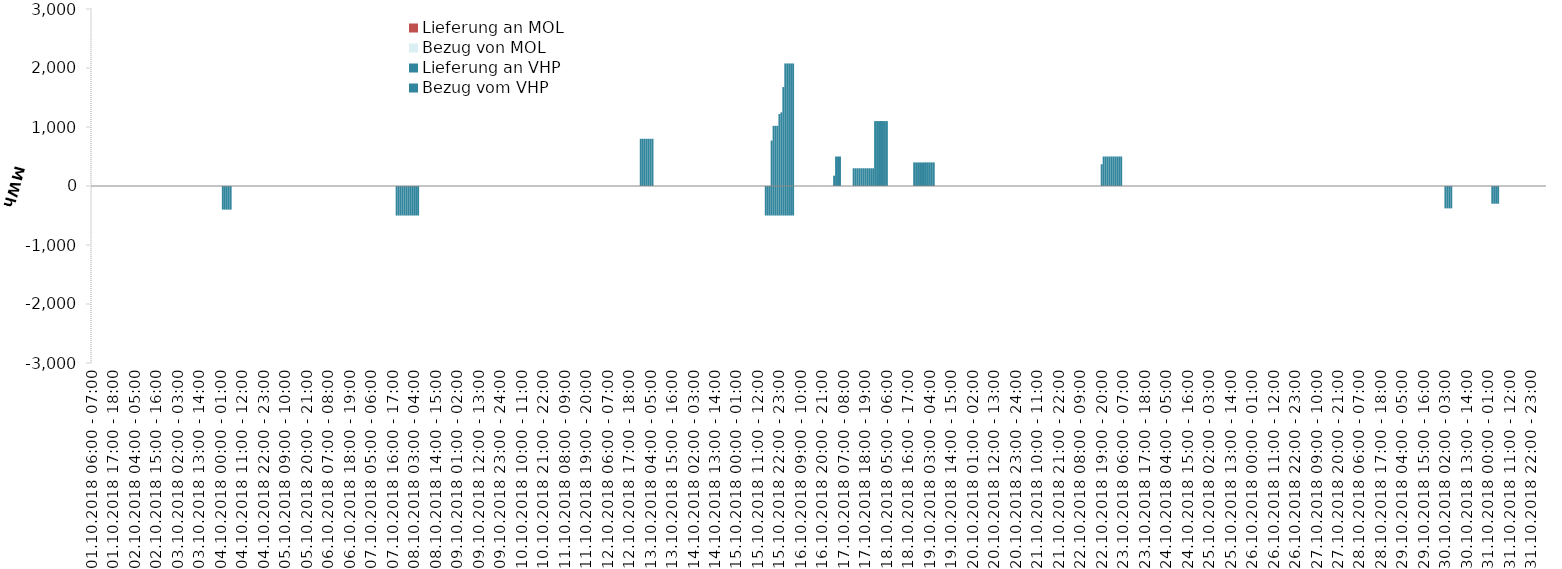
| Category | Bezug vom VHP | Lieferung an VHP | Bezug von MOL | Lieferung an MOL |
|---|---|---|---|---|
| 01.10.2018 06:00 - 07:00 | 0 | 0 | 0 | 0 |
| 01.10.2018 07:00 - 08:00 | 0 | 0 | 0 | 0 |
| 01.10.2018 08:00 - 09:00 | 0 | 0 | 0 | 0 |
| 01.10.2018 09:00 - 10:00 | 0 | 0 | 0 | 0 |
| 01.10.2018 10:00 - 11:00 | 0 | 0 | 0 | 0 |
| 01.10.2018 11:00 - 12:00 | 0 | 0 | 0 | 0 |
| 01.10.2018 12:00 - 13:00 | 0 | 0 | 0 | 0 |
| 01.10.2018 13:00 - 14:00 | 0 | 0 | 0 | 0 |
| 01.10.2018 14:00 - 15:00 | 0 | 0 | 0 | 0 |
| 01.10.2018 15:00 - 16:00 | 0 | 0 | 0 | 0 |
| 01.10.2018 16:00 - 17:00 | 0 | 0 | 0 | 0 |
| 01.10.2018 17:00 - 18:00 | 0 | 0 | 0 | 0 |
| 01.10.2018 18:00 - 19:00 | 0 | 0 | 0 | 0 |
| 01.10.2018 19:00 - 20:00 | 0 | 0 | 0 | 0 |
| 01.10.2018 20:00 - 21:00 | 0 | 0 | 0 | 0 |
| 01.10.2018 21:00 - 22:00 | 0 | 0 | 0 | 0 |
| 01.10.2018 22:00 - 23:00 | 0 | 0 | 0 | 0 |
| 01.10.2018 23:00 - 24:00 | 0 | 0 | 0 | 0 |
| 02.10.2018 00:00 - 01:00 | 0 | 0 | 0 | 0 |
| 02.10.2018 01:00 - 02:00 | 0 | 0 | 0 | 0 |
| 02.10.2018 02:00 - 03:00 | 0 | 0 | 0 | 0 |
| 02.10.2018 03:00 - 04:00 | 0 | 0 | 0 | 0 |
| 02.10.2018 04:00 - 05:00 | 0 | 0 | 0 | 0 |
| 02.10.2018 05:00 - 06:00 | 0 | 0 | 0 | 0 |
| 02.10.2018 06:00 - 07:00 | 0 | 0 | 0 | 0 |
| 02.10.2018 07:00 - 08:00 | 0 | 0 | 0 | 0 |
| 02.10.2018 08:00 - 09:00 | 0 | 0 | 0 | 0 |
| 02.10.2018 09:00 - 10:00 | 0 | 0 | 0 | 0 |
| 02.10.2018 10:00 - 11:00 | 0 | 0 | 0 | 0 |
| 02.10.2018 11:00 - 12:00 | 0 | 0 | 0 | 0 |
| 02.10.2018 12:00 - 13:00 | 0 | 0 | 0 | 0 |
| 02.10.2018 13:00 - 14:00 | 0 | 0 | 0 | 0 |
| 02.10.2018 14:00 - 15:00 | 0 | 0 | 0 | 0 |
| 02.10.2018 15:00 - 16:00 | 0 | 0 | 0 | 0 |
| 02.10.2018 16:00 - 17:00 | 0 | 0 | 0 | 0 |
| 02.10.2018 17:00 - 18:00 | 0 | 0 | 0 | 0 |
| 02.10.2018 18:00 - 19:00 | 0 | 0 | 0 | 0 |
| 02.10.2018 19:00 - 20:00 | 0 | 0 | 0 | 0 |
| 02.10.2018 20:00 - 21:00 | 0 | 0 | 0 | 0 |
| 02.10.2018 21:00 - 22:00 | 0 | 0 | 0 | 0 |
| 02.10.2018 22:00 - 23:00 | 0 | 0 | 0 | 0 |
| 02.10.2018 23:00 - 24:00 | 0 | 0 | 0 | 0 |
| 03.10.2018 00:00 - 01:00 | 0 | 0 | 0 | 0 |
| 03.10.2018 01:00 - 02:00 | 0 | 0 | 0 | 0 |
| 03.10.2018 02:00 - 03:00 | 0 | 0 | 0 | 0 |
| 03.10.2018 03:00 - 04:00 | 0 | 0 | 0 | 0 |
| 03.10.2018 04:00 - 05:00 | 0 | 0 | 0 | 0 |
| 03.10.2018 05:00 - 06:00 | 0 | 0 | 0 | 0 |
| 03.10.2018 06:00 - 07:00 | 0 | 0 | 0 | 0 |
| 03.10.2018 07:00 - 08:00 | 0 | 0 | 0 | 0 |
| 03.10.2018 08:00 - 09:00 | 0 | 0 | 0 | 0 |
| 03.10.2018 09:00 - 10:00 | 0 | 0 | 0 | 0 |
| 03.10.2018 10:00 - 11:00 | 0 | 0 | 0 | 0 |
| 03.10.2018 11:00 - 12:00 | 0 | 0 | 0 | 0 |
| 03.10.2018 12:00 - 13:00 | 0 | 0 | 0 | 0 |
| 03.10.2018 13:00 - 14:00 | 0 | 0 | 0 | 0 |
| 03.10.2018 14:00 - 15:00 | 0 | 0 | 0 | 0 |
| 03.10.2018 15:00 - 16:00 | 0 | 0 | 0 | 0 |
| 03.10.2018 16:00 - 17:00 | 0 | 0 | 0 | 0 |
| 03.10.2018 17:00 - 18:00 | 0 | 0 | 0 | 0 |
| 03.10.2018 18:00 - 19:00 | 0 | 0 | 0 | 0 |
| 03.10.2018 19:00 - 20:00 | 0 | 0 | 0 | 0 |
| 03.10.2018 20:00 - 21:00 | 0 | 0 | 0 | 0 |
| 03.10.2018 21:00 - 22:00 | 0 | 0 | 0 | 0 |
| 03.10.2018 22:00 - 23:00 | 0 | 0 | 0 | 0 |
| 03.10.2018 23:00 - 24:00 | 0 | 0 | 0 | 0 |
| 04.10.2018 00:00 - 01:00 | 0 | 0 | 0 | 0 |
| 04.10.2018 01:00 - 02:00 | 0 | -400 | 0 | 0 |
| 04.10.2018 02:00 - 03:00 | 0 | -400 | 0 | 0 |
| 04.10.2018 03:00 - 04:00 | 0 | -400 | 0 | 0 |
| 04.10.2018 04:00 - 05:00 | 0 | -400 | 0 | 0 |
| 04.10.2018 05:00 - 06:00 | 0 | -400 | 0 | 0 |
| 04.10.2018 06:00 - 07:00 | 0 | 0 | 0 | 0 |
| 04.10.2018 07:00 - 08:00 | 0 | 0 | 0 | 0 |
| 04.10.2018 08:00 - 09:00 | 0 | 0 | 0 | 0 |
| 04.10.2018 09:00 - 10:00 | 0 | 0 | 0 | 0 |
| 04.10.2018 10:00 - 11:00 | 0 | 0 | 0 | 0 |
| 04.10.2018 11:00 - 12:00 | 0 | 0 | 0 | 0 |
| 04.10.2018 12:00 - 13:00 | 0 | 0 | 0 | 0 |
| 04.10.2018 13:00 - 14:00 | 0 | 0 | 0 | 0 |
| 04.10.2018 14:00 - 15:00 | 0 | 0 | 0 | 0 |
| 04.10.2018 15:00 - 16:00 | 0 | 0 | 0 | 0 |
| 04.10.2018 16:00 - 17:00 | 0 | 0 | 0 | 0 |
| 04.10.2018 17:00 - 18:00 | 0 | 0 | 0 | 0 |
| 04.10.2018 18:00 - 19:00 | 0 | 0 | 0 | 0 |
| 04.10.2018 19:00 - 20:00 | 0 | 0 | 0 | 0 |
| 04.10.2018 20:00 - 21:00 | 0 | 0 | 0 | 0 |
| 04.10.2018 21:00 - 22:00 | 0 | 0 | 0 | 0 |
| 04.10.2018 22:00 - 23:00 | 0 | 0 | 0 | 0 |
| 04.10.2018 23:00 - 24:00 | 0 | 0 | 0 | 0 |
| 05.10.2018 00:00 - 01:00 | 0 | 0 | 0 | 0 |
| 05.10.2018 01:00 - 02:00 | 0 | 0 | 0 | 0 |
| 05.10.2018 02:00 - 03:00 | 0 | 0 | 0 | 0 |
| 05.10.2018 03:00 - 04:00 | 0 | 0 | 0 | 0 |
| 05.10.2018 04:00 - 05:00 | 0 | 0 | 0 | 0 |
| 05.10.2018 05:00 - 06:00 | 0 | 0 | 0 | 0 |
| 05.10.2018 06:00 - 07:00 | 0 | 0 | 0 | 0 |
| 05.10.2018 07:00 - 08:00 | 0 | 0 | 0 | 0 |
| 05.10.2018 08:00 - 09:00 | 0 | 0 | 0 | 0 |
| 05.10.2018 09:00 - 10:00 | 0 | 0 | 0 | 0 |
| 05.10.2018 10:00 - 11:00 | 0 | 0 | 0 | 0 |
| 05.10.2018 11:00 - 12:00 | 0 | 0 | 0 | 0 |
| 05.10.2018 12:00 - 13:00 | 0 | 0 | 0 | 0 |
| 05.10.2018 13:00 - 14:00 | 0 | 0 | 0 | 0 |
| 05.10.2018 14:00 - 15:00 | 0 | 0 | 0 | 0 |
| 05.10.2018 15:00 - 16:00 | 0 | 0 | 0 | 0 |
| 05.10.2018 16:00 - 17:00 | 0 | 0 | 0 | 0 |
| 05.10.2018 17:00 - 18:00 | 0 | 0 | 0 | 0 |
| 05.10.2018 18:00 - 19:00 | 0 | 0 | 0 | 0 |
| 05.10.2018 19:00 - 20:00 | 0 | 0 | 0 | 0 |
| 05.10.2018 20:00 - 21:00 | 0 | 0 | 0 | 0 |
| 05.10.2018 21:00 - 22:00 | 0 | 0 | 0 | 0 |
| 05.10.2018 22:00 - 23:00 | 0 | 0 | 0 | 0 |
| 05.10.2018 23:00 - 24:00 | 0 | 0 | 0 | 0 |
| 06.10.2018 00:00 - 01:00 | 0 | 0 | 0 | 0 |
| 06.10.2018 01:00 - 02:00 | 0 | 0 | 0 | 0 |
| 06.10.2018 02:00 - 03:00 | 0 | 0 | 0 | 0 |
| 06.10.2018 03:00 - 04:00 | 0 | 0 | 0 | 0 |
| 06.10.2018 04:00 - 05:00 | 0 | 0 | 0 | 0 |
| 06.10.2018 05:00 - 06:00 | 0 | 0 | 0 | 0 |
| 06.10.2018 06:00 - 07:00 | 0 | 0 | 0 | 0 |
| 06.10.2018 07:00 - 08:00 | 0 | 0 | 0 | 0 |
| 06.10.2018 08:00 - 09:00 | 0 | 0 | 0 | 0 |
| 06.10.2018 09:00 - 10:00 | 0 | 0 | 0 | 0 |
| 06.10.2018 10:00 - 11:00 | 0 | 0 | 0 | 0 |
| 06.10.2018 11:00 - 12:00 | 0 | 0 | 0 | 0 |
| 06.10.2018 12:00 - 13:00 | 0 | 0 | 0 | 0 |
| 06.10.2018 13:00 - 14:00 | 0 | 0 | 0 | 0 |
| 06.10.2018 14:00 - 15:00 | 0 | 0 | 0 | 0 |
| 06.10.2018 15:00 - 16:00 | 0 | 0 | 0 | 0 |
| 06.10.2018 16:00 - 17:00 | 0 | 0 | 0 | 0 |
| 06.10.2018 17:00 - 18:00 | 0 | 0 | 0 | 0 |
| 06.10.2018 18:00 - 19:00 | 0 | 0 | 0 | 0 |
| 06.10.2018 19:00 - 20:00 | 0 | 0 | 0 | 0 |
| 06.10.2018 20:00 - 21:00 | 0 | 0 | 0 | 0 |
| 06.10.2018 21:00 - 22:00 | 0 | 0 | 0 | 0 |
| 06.10.2018 22:00 - 23:00 | 0 | 0 | 0 | 0 |
| 06.10.2018 23:00 - 24:00 | 0 | 0 | 0 | 0 |
| 07.10.2018 00:00 - 01:00 | 0 | 0 | 0 | 0 |
| 07.10.2018 01:00 - 02:00 | 0 | 0 | 0 | 0 |
| 07.10.2018 02:00 - 03:00 | 0 | 0 | 0 | 0 |
| 07.10.2018 03:00 - 04:00 | 0 | 0 | 0 | 0 |
| 07.10.2018 04:00 - 05:00 | 0 | 0 | 0 | 0 |
| 07.10.2018 05:00 - 06:00 | 0 | 0 | 0 | 0 |
| 07.10.2018 06:00 - 07:00 | 0 | 0 | 0 | 0 |
| 07.10.2018 07:00 - 08:00 | 0 | 0 | 0 | 0 |
| 07.10.2018 08:00 - 09:00 | 0 | 0 | 0 | 0 |
| 07.10.2018 09:00 - 10:00 | 0 | 0 | 0 | 0 |
| 07.10.2018 10:00 - 11:00 | 0 | 0 | 0 | 0 |
| 07.10.2018 11:00 - 12:00 | 0 | 0 | 0 | 0 |
| 07.10.2018 12:00 - 13:00 | 0 | 0 | 0 | 0 |
| 07.10.2018 13:00 - 14:00 | 0 | 0 | 0 | 0 |
| 07.10.2018 14:00 - 15:00 | 0 | 0 | 0 | 0 |
| 07.10.2018 15:00 - 16:00 | 0 | 0 | 0 | 0 |
| 07.10.2018 16:00 - 17:00 | 0 | 0 | 0 | 0 |
| 07.10.2018 17:00 - 18:00 | 0 | 0 | 0 | 0 |
| 07.10.2018 18:00 - 19:00 | 0 | -500 | 0 | 0 |
| 07.10.2018 19:00 - 20:00 | 0 | -500 | 0 | 0 |
| 07.10.2018 20:00 - 21:00 | 0 | -500 | 0 | 0 |
| 07.10.2018 21:00 - 22:00 | 0 | -500 | 0 | 0 |
| 07.10.2018 22:00 - 23:00 | 0 | -500 | 0 | 0 |
| 07.10.2018 23:00 - 24:00 | 0 | -500 | 0 | 0 |
| 08.10.2018 00:00 - 01:00 | 0 | -500 | 0 | 0 |
| 08.10.2018 01:00 - 02:00 | 0 | -500 | 0 | 0 |
| 08.10.2018 02:00 - 03:00 | 0 | -500 | 0 | 0 |
| 08.10.2018 03:00 - 04:00 | 0 | -500 | 0 | 0 |
| 08.10.2018 04:00 - 05:00 | 0 | -500 | 0 | 0 |
| 08.10.2018 05:00 - 06:00 | 0 | -500 | 0 | 0 |
| 08.10.2018 06:00 - 07:00 | 0 | 0 | 0 | 0 |
| 08.10.2018 07:00 - 08:00 | 0 | 0 | 0 | 0 |
| 08.10.2018 08:00 - 09:00 | 0 | 0 | 0 | 0 |
| 08.10.2018 09:00 - 10:00 | 0 | 0 | 0 | 0 |
| 08.10.2018 10:00 - 11:00 | 0 | 0 | 0 | 0 |
| 08.10.2018 11:00 - 12:00 | 0 | 0 | 0 | 0 |
| 08.10.2018 12:00 - 13:00 | 0 | 0 | 0 | 0 |
| 08.10.2018 13:00 - 14:00 | 0 | 0 | 0 | 0 |
| 08.10.2018 14:00 - 15:00 | 0 | 0 | 0 | 0 |
| 08.10.2018 15:00 - 16:00 | 0 | 0 | 0 | 0 |
| 08.10.2018 16:00 - 17:00 | 0 | 0 | 0 | 0 |
| 08.10.2018 17:00 - 18:00 | 0 | 0 | 0 | 0 |
| 08.10.2018 18:00 - 19:00 | 0 | 0 | 0 | 0 |
| 08.10.2018 19:00 - 20:00 | 0 | 0 | 0 | 0 |
| 08.10.2018 20:00 - 21:00 | 0 | 0 | 0 | 0 |
| 08.10.2018 21:00 - 22:00 | 0 | 0 | 0 | 0 |
| 08.10.2018 22:00 - 23:00 | 0 | 0 | 0 | 0 |
| 08.10.2018 23:00 - 24:00 | 0 | 0 | 0 | 0 |
| 09.10.2018 00:00 - 01:00 | 0 | 0 | 0 | 0 |
| 09.10.2018 01:00 - 02:00 | 0 | 0 | 0 | 0 |
| 09.10.2018 02:00 - 03:00 | 0 | 0 | 0 | 0 |
| 09.10.2018 03:00 - 04:00 | 0 | 0 | 0 | 0 |
| 09.10.2018 04:00 - 05:00 | 0 | 0 | 0 | 0 |
| 09.10.2018 05:00 - 06:00 | 0 | 0 | 0 | 0 |
| 09.10.2018 06:00 - 07:00 | 0 | 0 | 0 | 0 |
| 09.10.2018 07:00 - 08:00 | 0 | 0 | 0 | 0 |
| 09.10.2018 08:00 - 09:00 | 0 | 0 | 0 | 0 |
| 09.10.2018 09:00 - 10:00 | 0 | 0 | 0 | 0 |
| 09.10.2018 10:00 - 11:00 | 0 | 0 | 0 | 0 |
| 09.10.2018 11:00 - 12:00 | 0 | 0 | 0 | 0 |
| 09.10.2018 12:00 - 13:00 | 0 | 0 | 0 | 0 |
| 09.10.2018 13:00 - 14:00 | 0 | 0 | 0 | 0 |
| 09.10.2018 14:00 - 15:00 | 0 | 0 | 0 | 0 |
| 09.10.2018 15:00 - 16:00 | 0 | 0 | 0 | 0 |
| 09.10.2018 16:00 - 17:00 | 0 | 0 | 0 | 0 |
| 09.10.2018 17:00 - 18:00 | 0 | 0 | 0 | 0 |
| 09.10.2018 18:00 - 19:00 | 0 | 0 | 0 | 0 |
| 09.10.2018 19:00 - 20:00 | 0 | 0 | 0 | 0 |
| 09.10.2018 20:00 - 21:00 | 0 | 0 | 0 | 0 |
| 09.10.2018 21:00 - 22:00 | 0 | 0 | 0 | 0 |
| 09.10.2018 22:00 - 23:00 | 0 | 0 | 0 | 0 |
| 09.10.2018 23:00 - 24:00 | 0 | 0 | 0 | 0 |
| 10.10.2018 00:00 - 01:00 | 0 | 0 | 0 | 0 |
| 10.10.2018 01:00 - 02:00 | 0 | 0 | 0 | 0 |
| 10.10.2018 02:00 - 03:00 | 0 | 0 | 0 | 0 |
| 10.10.2018 03:00 - 04:00 | 0 | 0 | 0 | 0 |
| 10.10.2018 04:00 - 05:00 | 0 | 0 | 0 | 0 |
| 10.10.2018 05:00 - 06:00 | 0 | 0 | 0 | 0 |
| 10.10.2018 06:00 - 07:00 | 0 | 0 | 0 | 0 |
| 10.10.2018 07:00 - 08:00 | 0 | 0 | 0 | 0 |
| 10.10.2018 08:00 - 09:00 | 0 | 0 | 0 | 0 |
| 10.10.2018 09:00 - 10:00 | 0 | 0 | 0 | 0 |
| 10.10.2018 10:00 - 11:00 | 0 | 0 | 0 | 0 |
| 10.10.2018 11:00 - 12:00 | 0 | 0 | 0 | 0 |
| 10.10.2018 12:00 - 13:00 | 0 | 0 | 0 | 0 |
| 10.10.2018 13:00 - 14:00 | 0 | 0 | 0 | 0 |
| 10.10.2018 14:00 - 15:00 | 0 | 0 | 0 | 0 |
| 10.10.2018 15:00 - 16:00 | 0 | 0 | 0 | 0 |
| 10.10.2018 16:00 - 17:00 | 0 | 0 | 0 | 0 |
| 10.10.2018 17:00 - 18:00 | 0 | 0 | 0 | 0 |
| 10.10.2018 18:00 - 19:00 | 0 | 0 | 0 | 0 |
| 10.10.2018 19:00 - 20:00 | 0 | 0 | 0 | 0 |
| 10.10.2018 20:00 - 21:00 | 0 | 0 | 0 | 0 |
| 10.10.2018 21:00 - 22:00 | 0 | 0 | 0 | 0 |
| 10.10.2018 22:00 - 23:00 | 0 | 0 | 0 | 0 |
| 10.10.2018 23:00 - 24:00 | 0 | 0 | 0 | 0 |
| 11.10.2018 00:00 - 01:00 | 0 | 0 | 0 | 0 |
| 11.10.2018 01:00 - 02:00 | 0 | 0 | 0 | 0 |
| 11.10.2018 02:00 - 03:00 | 0 | 0 | 0 | 0 |
| 11.10.2018 03:00 - 04:00 | 0 | 0 | 0 | 0 |
| 11.10.2018 04:00 - 05:00 | 0 | 0 | 0 | 0 |
| 11.10.2018 05:00 - 06:00 | 0 | 0 | 0 | 0 |
| 11.10.2018 06:00 - 07:00 | 0 | 0 | 0 | 0 |
| 11.10.2018 07:00 - 08:00 | 0 | 0 | 0 | 0 |
| 11.10.2018 08:00 - 09:00 | 0 | 0 | 0 | 0 |
| 11.10.2018 09:00 - 10:00 | 0 | 0 | 0 | 0 |
| 11.10.2018 10:00 - 11:00 | 0 | 0 | 0 | 0 |
| 11.10.2018 11:00 - 12:00 | 0 | 0 | 0 | 0 |
| 11.10.2018 12:00 - 13:00 | 0 | 0 | 0 | 0 |
| 11.10.2018 13:00 - 14:00 | 0 | 0 | 0 | 0 |
| 11.10.2018 14:00 - 15:00 | 0 | 0 | 0 | 0 |
| 11.10.2018 15:00 - 16:00 | 0 | 0 | 0 | 0 |
| 11.10.2018 16:00 - 17:00 | 0 | 0 | 0 | 0 |
| 11.10.2018 17:00 - 18:00 | 0 | 0 | 0 | 0 |
| 11.10.2018 18:00 - 19:00 | 0 | 0 | 0 | 0 |
| 11.10.2018 19:00 - 20:00 | 0 | 0 | 0 | 0 |
| 11.10.2018 20:00 - 21:00 | 0 | 0 | 0 | 0 |
| 11.10.2018 21:00 - 22:00 | 0 | 0 | 0 | 0 |
| 11.10.2018 22:00 - 23:00 | 0 | 0 | 0 | 0 |
| 11.10.2018 23:00 - 24:00 | 0 | 0 | 0 | 0 |
| 12.10.2018 00:00 - 01:00 | 0 | 0 | 0 | 0 |
| 12.10.2018 01:00 - 02:00 | 0 | 0 | 0 | 0 |
| 12.10.2018 02:00 - 03:00 | 0 | 0 | 0 | 0 |
| 12.10.2018 03:00 - 04:00 | 0 | 0 | 0 | 0 |
| 12.10.2018 04:00 - 05:00 | 0 | 0 | 0 | 0 |
| 12.10.2018 05:00 - 06:00 | 0 | 0 | 0 | 0 |
| 12.10.2018 06:00 - 07:00 | 0 | 0 | 0 | 0 |
| 12.10.2018 07:00 - 08:00 | 0 | 0 | 0 | 0 |
| 12.10.2018 08:00 - 09:00 | 0 | 0 | 0 | 0 |
| 12.10.2018 09:00 - 10:00 | 0 | 0 | 0 | 0 |
| 12.10.2018 10:00 - 11:00 | 0 | 0 | 0 | 0 |
| 12.10.2018 11:00 - 12:00 | 0 | 0 | 0 | 0 |
| 12.10.2018 12:00 - 13:00 | 0 | 0 | 0 | 0 |
| 12.10.2018 13:00 - 14:00 | 0 | 0 | 0 | 0 |
| 12.10.2018 14:00 - 15:00 | 0 | 0 | 0 | 0 |
| 12.10.2018 15:00 - 16:00 | 0 | 0 | 0 | 0 |
| 12.10.2018 16:00 - 17:00 | 0 | 0 | 0 | 0 |
| 12.10.2018 17:00 - 18:00 | 0 | 0 | 0 | 0 |
| 12.10.2018 18:00 - 19:00 | 0 | 0 | 0 | 0 |
| 12.10.2018 19:00 - 20:00 | 0 | 0 | 0 | 0 |
| 12.10.2018 20:00 - 21:00 | 0 | 0 | 0 | 0 |
| 12.10.2018 21:00 - 22:00 | 0 | 0 | 0 | 0 |
| 12.10.2018 22:00 - 23:00 | 0 | 0 | 0 | 0 |
| 12.10.2018 23:00 - 24:00 | 800 | 0 | 0 | 0 |
| 13.10.2018 00:00 - 01:00 | 800 | 0 | 0 | 0 |
| 13.10.2018 01:00 - 02:00 | 800 | 0 | 0 | 0 |
| 13.10.2018 02:00 - 03:00 | 800 | 0 | 0 | 0 |
| 13.10.2018 03:00 - 04:00 | 800 | 0 | 0 | 0 |
| 13.10.2018 04:00 - 05:00 | 800 | 0 | 0 | 0 |
| 13.10.2018 05:00 - 06:00 | 800 | 0 | 0 | 0 |
| 13.10.2018 06:00 - 07:00 | 0 | 0 | 0 | 0 |
| 13.10.2018 07:00 - 08:00 | 0 | 0 | 0 | 0 |
| 13.10.2018 08:00 - 09:00 | 0 | 0 | 0 | 0 |
| 13.10.2018 09:00 - 10:00 | 0 | 0 | 0 | 0 |
| 13.10.2018 10:00 - 11:00 | 0 | 0 | 0 | 0 |
| 13.10.2018 11:00 - 12:00 | 0 | 0 | 0 | 0 |
| 13.10.2018 12:00 - 13:00 | 0 | 0 | 0 | 0 |
| 13.10.2018 13:00 - 14:00 | 0 | 0 | 0 | 0 |
| 13.10.2018 14:00 - 15:00 | 0 | 0 | 0 | 0 |
| 13.10.2018 15:00 - 16:00 | 0 | 0 | 0 | 0 |
| 13.10.2018 16:00 - 17:00 | 0 | 0 | 0 | 0 |
| 13.10.2018 17:00 - 18:00 | 0 | 0 | 0 | 0 |
| 13.10.2018 18:00 - 19:00 | 0 | 0 | 0 | 0 |
| 13.10.2018 19:00 - 20:00 | 0 | 0 | 0 | 0 |
| 13.10.2018 20:00 - 21:00 | 0 | 0 | 0 | 0 |
| 13.10.2018 21:00 - 22:00 | 0 | 0 | 0 | 0 |
| 13.10.2018 22:00 - 23:00 | 0 | 0 | 0 | 0 |
| 13.10.2018 23:00 - 24:00 | 0 | 0 | 0 | 0 |
| 14.10.2018 00:00 - 01:00 | 0 | 0 | 0 | 0 |
| 14.10.2018 01:00 - 02:00 | 0 | 0 | 0 | 0 |
| 14.10.2018 02:00 - 03:00 | 0 | 0 | 0 | 0 |
| 14.10.2018 03:00 - 04:00 | 0 | 0 | 0 | 0 |
| 14.10.2018 04:00 - 05:00 | 0 | 0 | 0 | 0 |
| 14.10.2018 05:00 - 06:00 | 0 | 0 | 0 | 0 |
| 14.10.2018 06:00 - 07:00 | 0 | 0 | 0 | 0 |
| 14.10.2018 07:00 - 08:00 | 0 | 0 | 0 | 0 |
| 14.10.2018 08:00 - 09:00 | 0 | 0 | 0 | 0 |
| 14.10.2018 09:00 - 10:00 | 0 | 0 | 0 | 0 |
| 14.10.2018 10:00 - 11:00 | 0 | 0 | 0 | 0 |
| 14.10.2018 11:00 - 12:00 | 0 | 0 | 0 | 0 |
| 14.10.2018 12:00 - 13:00 | 0 | 0 | 0 | 0 |
| 14.10.2018 13:00 - 14:00 | 0 | 0 | 0 | 0 |
| 14.10.2018 14:00 - 15:00 | 0 | 0 | 0 | 0 |
| 14.10.2018 15:00 - 16:00 | 0 | 0 | 0 | 0 |
| 14.10.2018 16:00 - 17:00 | 0 | 0 | 0 | 0 |
| 14.10.2018 17:00 - 18:00 | 0 | 0 | 0 | 0 |
| 14.10.2018 18:00 - 19:00 | 0 | 0 | 0 | 0 |
| 14.10.2018 19:00 - 20:00 | 0 | 0 | 0 | 0 |
| 14.10.2018 20:00 - 21:00 | 0 | 0 | 0 | 0 |
| 14.10.2018 21:00 - 22:00 | 0 | 0 | 0 | 0 |
| 14.10.2018 22:00 - 23:00 | 0 | 0 | 0 | 0 |
| 14.10.2018 23:00 - 24:00 | 0 | 0 | 0 | 0 |
| 15.10.2018 00:00 - 01:00 | 0 | 0 | 0 | 0 |
| 15.10.2018 01:00 - 02:00 | 0 | 0 | 0 | 0 |
| 15.10.2018 02:00 - 03:00 | 0 | 0 | 0 | 0 |
| 15.10.2018 03:00 - 04:00 | 0 | 0 | 0 | 0 |
| 15.10.2018 04:00 - 05:00 | 0 | 0 | 0 | 0 |
| 15.10.2018 05:00 - 06:00 | 0 | 0 | 0 | 0 |
| 15.10.2018 06:00 - 07:00 | 0 | 0 | 0 | 0 |
| 15.10.2018 07:00 - 08:00 | 0 | 0 | 0 | 0 |
| 15.10.2018 08:00 - 09:00 | 0 | 0 | 0 | 0 |
| 15.10.2018 09:00 - 10:00 | 0 | 0 | 0 | 0 |
| 15.10.2018 10:00 - 11:00 | 0 | 0 | 0 | 0 |
| 15.10.2018 11:00 - 12:00 | 0 | 0 | 0 | 0 |
| 15.10.2018 12:00 - 13:00 | 0 | 0 | 0 | 0 |
| 15.10.2018 13:00 - 14:00 | 0 | 0 | 0 | 0 |
| 15.10.2018 14:00 - 15:00 | 0 | 0 | 0 | 0 |
| 15.10.2018 15:00 - 16:00 | 0 | -500 | 0 | 0 |
| 15.10.2018 16:00 - 17:00 | 0 | -500 | 0 | 0 |
| 15.10.2018 17:00 - 18:00 | 0 | -500 | 0 | 0 |
| 15.10.2018 18:00 - 19:00 | 770 | -500 | 0 | 0 |
| 15.10.2018 19:00 - 20:00 | 1020 | -500 | 0 | 0 |
| 15.10.2018 20:00 - 21:00 | 1020 | -500 | 0 | 0 |
| 15.10.2018 21:00 - 22:00 | 1020 | -500 | 0 | 0 |
| 15.10.2018 22:00 - 23:00 | 1220 | -500 | 0 | 0 |
| 15.10.2018 23:00 - 24:00 | 1248 | -500 | 0 | 0 |
| 16.10.2018 00:00 - 01:00 | 1677 | -500 | 0 | 0 |
| 16.10.2018 01:00 - 02:00 | 2077 | -500 | 0 | 0 |
| 16.10.2018 02:00 - 03:00 | 2077 | -500 | 0 | 0 |
| 16.10.2018 03:00 - 04:00 | 2077 | -500 | 0 | 0 |
| 16.10.2018 04:00 - 05:00 | 2077 | -500 | 0 | 0 |
| 16.10.2018 05:00 - 06:00 | 2077 | -500 | 0 | 0 |
| 16.10.2018 06:00 - 07:00 | 0 | 0 | 0 | 0 |
| 16.10.2018 07:00 - 08:00 | 0 | 0 | 0 | 0 |
| 16.10.2018 08:00 - 09:00 | 0 | 0 | 0 | 0 |
| 16.10.2018 09:00 - 10:00 | 0 | 0 | 0 | 0 |
| 16.10.2018 10:00 - 11:00 | 0 | 0 | 0 | 0 |
| 16.10.2018 11:00 - 12:00 | 0 | 0 | 0 | 0 |
| 16.10.2018 12:00 - 13:00 | 0 | 0 | 0 | 0 |
| 16.10.2018 13:00 - 14:00 | 0 | 0 | 0 | 0 |
| 16.10.2018 14:00 - 15:00 | 0 | 0 | 0 | 0 |
| 16.10.2018 15:00 - 16:00 | 0 | 0 | 0 | 0 |
| 16.10.2018 16:00 - 17:00 | 0 | 0 | 0 | 0 |
| 16.10.2018 17:00 - 18:00 | 0 | 0 | 0 | 0 |
| 16.10.2018 18:00 - 19:00 | 0 | 0 | 0 | 0 |
| 16.10.2018 19:00 - 20:00 | 0 | 0 | 0 | 0 |
| 16.10.2018 20:00 - 21:00 | 0 | 0 | 0 | 0 |
| 16.10.2018 21:00 - 22:00 | 0 | 0 | 0 | 0 |
| 16.10.2018 22:00 - 23:00 | 0 | 0 | 0 | 0 |
| 16.10.2018 23:00 - 24:00 | 0 | 0 | 0 | 0 |
| 17.10.2018 00:00 - 01:00 | 0 | 0 | 0 | 0 |
| 17.10.2018 01:00 - 02:00 | 0 | 0 | 0 | 0 |
| 17.10.2018 02:00 - 03:00 | 175 | 0 | 0 | 0 |
| 17.10.2018 03:00 - 04:00 | 500 | 0 | 0 | 0 |
| 17.10.2018 04:00 - 05:00 | 500 | 0 | 0 | 0 |
| 17.10.2018 05:00 - 06:00 | 500 | 0 | 0 | 0 |
| 17.10.2018 06:00 - 07:00 | 0 | 0 | 0 | 0 |
| 17.10.2018 07:00 - 08:00 | 0 | 0 | 0 | 0 |
| 17.10.2018 08:00 - 09:00 | 0 | 0 | 0 | 0 |
| 17.10.2018 09:00 - 10:00 | 0 | 0 | 0 | 0 |
| 17.10.2018 10:00 - 11:00 | 0 | 0 | 0 | 0 |
| 17.10.2018 11:00 - 12:00 | 0 | 0 | 0 | 0 |
| 17.10.2018 12:00 - 13:00 | 300 | 0 | 0 | 0 |
| 17.10.2018 13:00 - 14:00 | 300 | 0 | 0 | 0 |
| 17.10.2018 14:00 - 15:00 | 300 | 0 | 0 | 0 |
| 17.10.2018 15:00 - 16:00 | 300 | 0 | 0 | 0 |
| 17.10.2018 16:00 - 17:00 | 300 | 0 | 0 | 0 |
| 17.10.2018 17:00 - 18:00 | 300 | 0 | 0 | 0 |
| 17.10.2018 18:00 - 19:00 | 300 | 0 | 0 | 0 |
| 17.10.2018 19:00 - 20:00 | 300 | 0 | 0 | 0 |
| 17.10.2018 20:00 - 21:00 | 300 | 0 | 0 | 0 |
| 17.10.2018 21:00 - 22:00 | 300 | 0 | 0 | 0 |
| 17.10.2018 22:00 - 23:00 | 300 | 0 | 0 | 0 |
| 17.10.2018 23:00 - 24:00 | 1100 | 0 | 0 | 0 |
| 18.10.2018 00:00 - 01:00 | 1100 | 0 | 0 | 0 |
| 18.10.2018 01:00 - 02:00 | 1100 | 0 | 0 | 0 |
| 18.10.2018 02:00 - 03:00 | 1100 | 0 | 0 | 0 |
| 18.10.2018 03:00 - 04:00 | 1100 | 0 | 0 | 0 |
| 18.10.2018 04:00 - 05:00 | 1100 | 0 | 0 | 0 |
| 18.10.2018 05:00 - 06:00 | 1100 | 0 | 0 | 0 |
| 18.10.2018 06:00 - 07:00 | 0 | 0 | 0 | 0 |
| 18.10.2018 07:00 - 08:00 | 0 | 0 | 0 | 0 |
| 18.10.2018 08:00 - 09:00 | 0 | 0 | 0 | 0 |
| 18.10.2018 09:00 - 10:00 | 0 | 0 | 0 | 0 |
| 18.10.2018 10:00 - 11:00 | 0 | 0 | 0 | 0 |
| 18.10.2018 11:00 - 12:00 | 0 | 0 | 0 | 0 |
| 18.10.2018 12:00 - 13:00 | 0 | 0 | 0 | 0 |
| 18.10.2018 13:00 - 14:00 | 0 | 0 | 0 | 0 |
| 18.10.2018 14:00 - 15:00 | 0 | 0 | 0 | 0 |
| 18.10.2018 15:00 - 16:00 | 0 | 0 | 0 | 0 |
| 18.10.2018 16:00 - 17:00 | 0 | 0 | 0 | 0 |
| 18.10.2018 17:00 - 18:00 | 0 | 0 | 0 | 0 |
| 18.10.2018 18:00 - 19:00 | 0 | 0 | 0 | 0 |
| 18.10.2018 19:00 - 20:00 | 400 | 0 | 0 | 0 |
| 18.10.2018 20:00 - 21:00 | 400 | 0 | 0 | 0 |
| 18.10.2018 21:00 - 22:00 | 400 | 0 | 0 | 0 |
| 18.10.2018 22:00 - 23:00 | 400 | 0 | 0 | 0 |
| 18.10.2018 23:00 - 24:00 | 400 | 0 | 0 | 0 |
| 19.10.2018 00:00 - 01:00 | 400 | 0 | 0 | 0 |
| 19.10.2018 01:00 - 02:00 | 400 | 0 | 0 | 0 |
| 19.10.2018 02:00 - 03:00 | 400 | 0 | 0 | 0 |
| 19.10.2018 03:00 - 04:00 | 400 | 0 | 0 | 0 |
| 19.10.2018 04:00 - 05:00 | 400 | 0 | 0 | 0 |
| 19.10.2018 05:00 - 06:00 | 400 | 0 | 0 | 0 |
| 19.10.2018 06:00 - 07:00 | 0 | 0 | 0 | 0 |
| 19.10.2018 07:00 - 08:00 | 0 | 0 | 0 | 0 |
| 19.10.2018 08:00 - 09:00 | 0 | 0 | 0 | 0 |
| 19.10.2018 09:00 - 10:00 | 0 | 0 | 0 | 0 |
| 19.10.2018 10:00 - 11:00 | 0 | 0 | 0 | 0 |
| 19.10.2018 11:00 - 12:00 | 0 | 0 | 0 | 0 |
| 19.10.2018 12:00 - 13:00 | 0 | 0 | 0 | 0 |
| 19.10.2018 13:00 - 14:00 | 0 | 0 | 0 | 0 |
| 19.10.2018 14:00 - 15:00 | 0 | 0 | 0 | 0 |
| 19.10.2018 15:00 - 16:00 | 0 | 0 | 0 | 0 |
| 19.10.2018 16:00 - 17:00 | 0 | 0 | 0 | 0 |
| 19.10.2018 17:00 - 18:00 | 0 | 0 | 0 | 0 |
| 19.10.2018 18:00 - 19:00 | 0 | 0 | 0 | 0 |
| 19.10.2018 19:00 - 20:00 | 0 | 0 | 0 | 0 |
| 19.10.2018 20:00 - 21:00 | 0 | 0 | 0 | 0 |
| 19.10.2018 21:00 - 22:00 | 0 | 0 | 0 | 0 |
| 19.10.2018 22:00 - 23:00 | 0 | 0 | 0 | 0 |
| 19.10.2018 23:00 - 24:00 | 0 | 0 | 0 | 0 |
| 20.10.2018 00:00 - 01:00 | 0 | 0 | 0 | 0 |
| 20.10.2018 01:00 - 02:00 | 0 | 0 | 0 | 0 |
| 20.10.2018 02:00 - 03:00 | 0 | 0 | 0 | 0 |
| 20.10.2018 03:00 - 04:00 | 0 | 0 | 0 | 0 |
| 20.10.2018 04:00 - 05:00 | 0 | 0 | 0 | 0 |
| 20.10.2018 05:00 - 06:00 | 0 | 0 | 0 | 0 |
| 20.10.2018 06:00 - 07:00 | 0 | 0 | 0 | 0 |
| 20.10.2018 07:00 - 08:00 | 0 | 0 | 0 | 0 |
| 20.10.2018 08:00 - 09:00 | 0 | 0 | 0 | 0 |
| 20.10.2018 09:00 - 10:00 | 0 | 0 | 0 | 0 |
| 20.10.2018 10:00 - 11:00 | 0 | 0 | 0 | 0 |
| 20.10.2018 11:00 - 12:00 | 0 | 0 | 0 | 0 |
| 20.10.2018 12:00 - 13:00 | 0 | 0 | 0 | 0 |
| 20.10.2018 13:00 - 14:00 | 0 | 0 | 0 | 0 |
| 20.10.2018 14:00 - 15:00 | 0 | 0 | 0 | 0 |
| 20.10.2018 15:00 - 16:00 | 0 | 0 | 0 | 0 |
| 20.10.2018 16:00 - 17:00 | 0 | 0 | 0 | 0 |
| 20.10.2018 17:00 - 18:00 | 0 | 0 | 0 | 0 |
| 20.10.2018 18:00 - 19:00 | 0 | 0 | 0 | 0 |
| 20.10.2018 19:00 - 20:00 | 0 | 0 | 0 | 0 |
| 20.10.2018 20:00 - 21:00 | 0 | 0 | 0 | 0 |
| 20.10.2018 21:00 - 22:00 | 0 | 0 | 0 | 0 |
| 20.10.2018 22:00 - 23:00 | 0 | 0 | 0 | 0 |
| 20.10.2018 23:00 - 24:00 | 0 | 0 | 0 | 0 |
| 21.10.2018 00:00 - 01:00 | 0 | 0 | 0 | 0 |
| 21.10.2018 01:00 - 02:00 | 0 | 0 | 0 | 0 |
| 21.10.2018 02:00 - 03:00 | 0 | 0 | 0 | 0 |
| 21.10.2018 03:00 - 04:00 | 0 | 0 | 0 | 0 |
| 21.10.2018 04:00 - 05:00 | 0 | 0 | 0 | 0 |
| 21.10.2018 05:00 - 06:00 | 0 | 0 | 0 | 0 |
| 21.10.2018 06:00 - 07:00 | 0 | 0 | 0 | 0 |
| 21.10.2018 07:00 - 08:00 | 0 | 0 | 0 | 0 |
| 21.10.2018 08:00 - 09:00 | 0 | 0 | 0 | 0 |
| 21.10.2018 09:00 - 10:00 | 0 | 0 | 0 | 0 |
| 21.10.2018 10:00 - 11:00 | 0 | 0 | 0 | 0 |
| 21.10.2018 11:00 - 12:00 | 0 | 0 | 0 | 0 |
| 21.10.2018 12:00 - 13:00 | 0 | 0 | 0 | 0 |
| 21.10.2018 13:00 - 14:00 | 0 | 0 | 0 | 0 |
| 21.10.2018 14:00 - 15:00 | 0 | 0 | 0 | 0 |
| 21.10.2018 15:00 - 16:00 | 0 | 0 | 0 | 0 |
| 21.10.2018 16:00 - 17:00 | 0 | 0 | 0 | 0 |
| 21.10.2018 17:00 - 18:00 | 0 | 0 | 0 | 0 |
| 21.10.2018 18:00 - 19:00 | 0 | 0 | 0 | 0 |
| 21.10.2018 19:00 - 20:00 | 0 | 0 | 0 | 0 |
| 21.10.2018 20:00 - 21:00 | 0 | 0 | 0 | 0 |
| 21.10.2018 21:00 - 22:00 | 0 | 0 | 0 | 0 |
| 21.10.2018 22:00 - 23:00 | 0 | 0 | 0 | 0 |
| 21.10.2018 23:00 - 24:00 | 0 | 0 | 0 | 0 |
| 22.10.2018 00:00 - 01:00 | 0 | 0 | 0 | 0 |
| 22.10.2018 01:00 - 02:00 | 0 | 0 | 0 | 0 |
| 22.10.2018 02:00 - 03:00 | 0 | 0 | 0 | 0 |
| 22.10.2018 03:00 - 04:00 | 0 | 0 | 0 | 0 |
| 22.10.2018 04:00 - 05:00 | 0 | 0 | 0 | 0 |
| 22.10.2018 05:00 - 06:00 | 0 | 0 | 0 | 0 |
| 22.10.2018 06:00 - 07:00 | 0 | 0 | 0 | 0 |
| 22.10.2018 07:00 - 08:00 | 0 | 0 | 0 | 0 |
| 22.10.2018 08:00 - 09:00 | 0 | 0 | 0 | 0 |
| 22.10.2018 09:00 - 10:00 | 0 | 0 | 0 | 0 |
| 22.10.2018 10:00 - 11:00 | 0 | 0 | 0 | 0 |
| 22.10.2018 11:00 - 12:00 | 0 | 0 | 0 | 0 |
| 22.10.2018 12:00 - 13:00 | 0 | 0 | 0 | 0 |
| 22.10.2018 13:00 - 14:00 | 0 | 0 | 0 | 0 |
| 22.10.2018 14:00 - 15:00 | 0 | 0 | 0 | 0 |
| 22.10.2018 15:00 - 16:00 | 0 | 0 | 0 | 0 |
| 22.10.2018 16:00 - 17:00 | 0 | 0 | 0 | 0 |
| 22.10.2018 17:00 - 18:00 | 0 | 0 | 0 | 0 |
| 22.10.2018 18:00 - 19:00 | 0 | 0 | 0 | 0 |
| 22.10.2018 19:00 - 20:00 | 369 | 0 | 0 | 0 |
| 22.10.2018 20:00 - 21:00 | 500 | 0 | 0 | 0 |
| 22.10.2018 21:00 - 22:00 | 500 | 0 | 0 | 0 |
| 22.10.2018 22:00 - 23:00 | 500 | 0 | 0 | 0 |
| 22.10.2018 23:00 - 24:00 | 500 | 0 | 0 | 0 |
| 23.10.2018 00:00 - 01:00 | 500 | 0 | 0 | 0 |
| 23.10.2018 01:00 - 02:00 | 500 | 0 | 0 | 0 |
| 23.10.2018 02:00 - 03:00 | 500 | 0 | 0 | 0 |
| 23.10.2018 03:00 - 04:00 | 500 | 0 | 0 | 0 |
| 23.10.2018 04:00 - 05:00 | 500 | 0 | 0 | 0 |
| 23.10.2018 05:00 - 06:00 | 500 | 0 | 0 | 0 |
| 23.10.2018 06:00 - 07:00 | 0 | 0 | 0 | 0 |
| 23.10.2018 07:00 - 08:00 | 0 | 0 | 0 | 0 |
| 23.10.2018 08:00 - 09:00 | 0 | 0 | 0 | 0 |
| 23.10.2018 09:00 - 10:00 | 0 | 0 | 0 | 0 |
| 23.10.2018 10:00 - 11:00 | 0 | 0 | 0 | 0 |
| 23.10.2018 11:00 - 12:00 | 0 | 0 | 0 | 0 |
| 23.10.2018 12:00 - 13:00 | 0 | 0 | 0 | 0 |
| 23.10.2018 13:00 - 14:00 | 0 | 0 | 0 | 0 |
| 23.10.2018 14:00 - 15:00 | 0 | 0 | 0 | 0 |
| 23.10.2018 15:00 - 16:00 | 0 | 0 | 0 | 0 |
| 23.10.2018 16:00 - 17:00 | 0 | 0 | 0 | 0 |
| 23.10.2018 17:00 - 18:00 | 0 | 0 | 0 | 0 |
| 23.10.2018 18:00 - 19:00 | 0 | 0 | 0 | 0 |
| 23.10.2018 19:00 - 20:00 | 0 | 0 | 0 | 0 |
| 23.10.2018 20:00 - 21:00 | 0 | 0 | 0 | 0 |
| 23.10.2018 21:00 - 22:00 | 0 | 0 | 0 | 0 |
| 23.10.2018 22:00 - 23:00 | 0 | 0 | 0 | 0 |
| 23.10.2018 23:00 - 24:00 | 0 | 0 | 0 | 0 |
| 24.10.2018 00:00 - 01:00 | 0 | 0 | 0 | 0 |
| 24.10.2018 01:00 - 02:00 | 0 | 0 | 0 | 0 |
| 24.10.2018 02:00 - 03:00 | 0 | 0 | 0 | 0 |
| 24.10.2018 03:00 - 04:00 | 0 | 0 | 0 | 0 |
| 24.10.2018 04:00 - 05:00 | 0 | 0 | 0 | 0 |
| 24.10.2018 05:00 - 06:00 | 0 | 0 | 0 | 0 |
| 24.10.2018 06:00 - 07:00 | 0 | 0 | 0 | 0 |
| 24.10.2018 07:00 - 08:00 | 0 | 0 | 0 | 0 |
| 24.10.2018 08:00 - 09:00 | 0 | 0 | 0 | 0 |
| 24.10.2018 09:00 - 10:00 | 0 | 0 | 0 | 0 |
| 24.10.2018 10:00 - 11:00 | 0 | 0 | 0 | 0 |
| 24.10.2018 11:00 - 12:00 | 0 | 0 | 0 | 0 |
| 24.10.2018 12:00 - 13:00 | 0 | 0 | 0 | 0 |
| 24.10.2018 13:00 - 14:00 | 0 | 0 | 0 | 0 |
| 24.10.2018 14:00 - 15:00 | 0 | 0 | 0 | 0 |
| 24.10.2018 15:00 - 16:00 | 0 | 0 | 0 | 0 |
| 24.10.2018 16:00 - 17:00 | 0 | 0 | 0 | 0 |
| 24.10.2018 17:00 - 18:00 | 0 | 0 | 0 | 0 |
| 24.10.2018 18:00 - 19:00 | 0 | 0 | 0 | 0 |
| 24.10.2018 19:00 - 20:00 | 0 | 0 | 0 | 0 |
| 24.10.2018 20:00 - 21:00 | 0 | 0 | 0 | 0 |
| 24.10.2018 21:00 - 22:00 | 0 | 0 | 0 | 0 |
| 24.10.2018 22:00 - 23:00 | 0 | 0 | 0 | 0 |
| 24.10.2018 23:00 - 24:00 | 0 | 0 | 0 | 0 |
| 25.10.2018 00:00 - 01:00 | 0 | 0 | 0 | 0 |
| 25.10.2018 01:00 - 02:00 | 0 | 0 | 0 | 0 |
| 25.10.2018 02:00 - 03:00 | 0 | 0 | 0 | 0 |
| 25.10.2018 03:00 - 04:00 | 0 | 0 | 0 | 0 |
| 25.10.2018 04:00 - 05:00 | 0 | 0 | 0 | 0 |
| 25.10.2018 05:00 - 06:00 | 0 | 0 | 0 | 0 |
| 25.10.2018 06:00 - 07:00 | 0 | 0 | 0 | 0 |
| 25.10.2018 07:00 - 08:00 | 0 | 0 | 0 | 0 |
| 25.10.2018 08:00 - 09:00 | 0 | 0 | 0 | 0 |
| 25.10.2018 09:00 - 10:00 | 0 | 0 | 0 | 0 |
| 25.10.2018 10:00 - 11:00 | 0 | 0 | 0 | 0 |
| 25.10.2018 11:00 - 12:00 | 0 | 0 | 0 | 0 |
| 25.10.2018 12:00 - 13:00 | 0 | 0 | 0 | 0 |
| 25.10.2018 13:00 - 14:00 | 0 | 0 | 0 | 0 |
| 25.10.2018 14:00 - 15:00 | 0 | 0 | 0 | 0 |
| 25.10.2018 15:00 - 16:00 | 0 | 0 | 0 | 0 |
| 25.10.2018 16:00 - 17:00 | 0 | 0 | 0 | 0 |
| 25.10.2018 17:00 - 18:00 | 0 | 0 | 0 | 0 |
| 25.10.2018 18:00 - 19:00 | 0 | 0 | 0 | 0 |
| 25.10.2018 19:00 - 20:00 | 0 | 0 | 0 | 0 |
| 25.10.2018 20:00 - 21:00 | 0 | 0 | 0 | 0 |
| 25.10.2018 21:00 - 22:00 | 0 | 0 | 0 | 0 |
| 25.10.2018 22:00 - 23:00 | 0 | 0 | 0 | 0 |
| 25.10.2018 23:00 - 24:00 | 0 | 0 | 0 | 0 |
| 26.10.2018 00:00 - 01:00 | 0 | 0 | 0 | 0 |
| 26.10.2018 01:00 - 02:00 | 0 | 0 | 0 | 0 |
| 26.10.2018 02:00 - 03:00 | 0 | 0 | 0 | 0 |
| 26.10.2018 03:00 - 04:00 | 0 | 0 | 0 | 0 |
| 26.10.2018 04:00 - 05:00 | 0 | 0 | 0 | 0 |
| 26.10.2018 05:00 - 06:00 | 0 | 0 | 0 | 0 |
| 26.10.2018 06:00 - 07:00 | 0 | 0 | 0 | 0 |
| 26.10.2018 07:00 - 08:00 | 0 | 0 | 0 | 0 |
| 26.10.2018 08:00 - 09:00 | 0 | 0 | 0 | 0 |
| 26.10.2018 09:00 - 10:00 | 0 | 0 | 0 | 0 |
| 26.10.2018 10:00 - 11:00 | 0 | 0 | 0 | 0 |
| 26.10.2018 11:00 - 12:00 | 0 | 0 | 0 | 0 |
| 26.10.2018 12:00 - 13:00 | 0 | 0 | 0 | 0 |
| 26.10.2018 13:00 - 14:00 | 0 | 0 | 0 | 0 |
| 26.10.2018 14:00 - 15:00 | 0 | 0 | 0 | 0 |
| 26.10.2018 15:00 - 16:00 | 0 | 0 | 0 | 0 |
| 26.10.2018 16:00 - 17:00 | 0 | 0 | 0 | 0 |
| 26.10.2018 17:00 - 18:00 | 0 | 0 | 0 | 0 |
| 26.10.2018 18:00 - 19:00 | 0 | 0 | 0 | 0 |
| 26.10.2018 19:00 - 20:00 | 0 | 0 | 0 | 0 |
| 26.10.2018 20:00 - 21:00 | 0 | 0 | 0 | 0 |
| 26.10.2018 21:00 - 22:00 | 0 | 0 | 0 | 0 |
| 26.10.2018 22:00 - 23:00 | 0 | 0 | 0 | 0 |
| 26.10.2018 23:00 - 24:00 | 0 | 0 | 0 | 0 |
| 27.10.2018 00:00 - 01:00 | 0 | 0 | 0 | 0 |
| 27.10.2018 01:00 - 02:00 | 0 | 0 | 0 | 0 |
| 27.10.2018 02:00 - 03:00 | 0 | 0 | 0 | 0 |
| 27.10.2018 03:00 - 04:00 | 0 | 0 | 0 | 0 |
| 27.10.2018 04:00 - 05:00 | 0 | 0 | 0 | 0 |
| 27.10.2018 05:00 - 06:00 | 0 | 0 | 0 | 0 |
| 27.10.2018 06:00 - 07:00 | 0 | 0 | 0 | 0 |
| 27.10.2018 07:00 - 08:00 | 0 | 0 | 0 | 0 |
| 27.10.2018 08:00 - 09:00 | 0 | 0 | 0 | 0 |
| 27.10.2018 09:00 - 10:00 | 0 | 0 | 0 | 0 |
| 27.10.2018 10:00 - 11:00 | 0 | 0 | 0 | 0 |
| 27.10.2018 11:00 - 12:00 | 0 | 0 | 0 | 0 |
| 27.10.2018 12:00 - 13:00 | 0 | 0 | 0 | 0 |
| 27.10.2018 13:00 - 14:00 | 0 | 0 | 0 | 0 |
| 27.10.2018 14:00 - 15:00 | 0 | 0 | 0 | 0 |
| 27.10.2018 15:00 - 16:00 | 0 | 0 | 0 | 0 |
| 27.10.2018 16:00 - 17:00 | 0 | 0 | 0 | 0 |
| 27.10.2018 17:00 - 18:00 | 0 | 0 | 0 | 0 |
| 27.10.2018 18:00 - 19:00 | 0 | 0 | 0 | 0 |
| 27.10.2018 19:00 - 20:00 | 0 | 0 | 0 | 0 |
| 27.10.2018 20:00 - 21:00 | 0 | 0 | 0 | 0 |
| 27.10.2018 21:00 - 22:00 | 0 | 0 | 0 | 0 |
| 27.10.2018 22:00 - 23:00 | 0 | 0 | 0 | 0 |
| 27.10.2018 23:00 - 24:00 | 0 | 0 | 0 | 0 |
| 28.10.2018 00:00 - 01:00 | 0 | 0 | 0 | 0 |
| 28.10.2018 01:00 - 02:00 | 0 | 0 | 0 | 0 |
| 28.10.2018 02:00 - 02:00 | 0 | 0 | 0 | 0 |
| 28.10.2018 02:00 - 03:00 | 0 | 0 | 0 | 0 |
| 28.10.2018 03:00 - 04:00 | 0 | 0 | 0 | 0 |
| 28.10.2018 04:00 - 05:00 | 0 | 0 | 0 | 0 |
| 28.10.2018 05:00 - 06:00 | 0 | 0 | 0 | 0 |
| 28.10.2018 06:00 - 07:00 | 0 | 0 | 0 | 0 |
| 28.10.2018 07:00 - 08:00 | 0 | 0 | 0 | 0 |
| 28.10.2018 08:00 - 09:00 | 0 | 0 | 0 | 0 |
| 28.10.2018 09:00 - 10:00 | 0 | 0 | 0 | 0 |
| 28.10.2018 10:00 - 11:00 | 0 | 0 | 0 | 0 |
| 28.10.2018 11:00 - 12:00 | 0 | 0 | 0 | 0 |
| 28.10.2018 12:00 - 13:00 | 0 | 0 | 0 | 0 |
| 28.10.2018 13:00 - 14:00 | 0 | 0 | 0 | 0 |
| 28.10.2018 14:00 - 15:00 | 0 | 0 | 0 | 0 |
| 28.10.2018 15:00 - 16:00 | 0 | 0 | 0 | 0 |
| 28.10.2018 16:00 - 17:00 | 0 | 0 | 0 | 0 |
| 28.10.2018 17:00 - 18:00 | 0 | 0 | 0 | 0 |
| 28.10.2018 18:00 - 19:00 | 0 | 0 | 0 | 0 |
| 28.10.2018 19:00 - 20:00 | 0 | 0 | 0 | 0 |
| 28.10.2018 20:00 - 21:00 | 0 | 0 | 0 | 0 |
| 28.10.2018 21:00 - 22:00 | 0 | 0 | 0 | 0 |
| 28.10.2018 22:00 - 23:00 | 0 | 0 | 0 | 0 |
| 28.10.2018 23:00 - 24:00 | 0 | 0 | 0 | 0 |
| 29.10.2018 00:00 - 01:00 | 0 | 0 | 0 | 0 |
| 29.10.2018 01:00 - 02:00 | 0 | 0 | 0 | 0 |
| 29.10.2018 02:00 - 03:00 | 0 | 0 | 0 | 0 |
| 29.10.2018 03:00 - 04:00 | 0 | 0 | 0 | 0 |
| 29.10.2018 04:00 - 05:00 | 0 | 0 | 0 | 0 |
| 29.10.2018 05:00 - 06:00 | 0 | 0 | 0 | 0 |
| 29.10.2018 06:00 - 07:00 | 0 | 0 | 0 | 0 |
| 29.10.2018 07:00 - 08:00 | 0 | 0 | 0 | 0 |
| 29.10.2018 08:00 - 09:00 | 0 | 0 | 0 | 0 |
| 29.10.2018 09:00 - 10:00 | 0 | 0 | 0 | 0 |
| 29.10.2018 10:00 - 11:00 | 0 | 0 | 0 | 0 |
| 29.10.2018 11:00 - 12:00 | 0 | 0 | 0 | 0 |
| 29.10.2018 12:00 - 13:00 | 0 | 0 | 0 | 0 |
| 29.10.2018 13:00 - 14:00 | 0 | 0 | 0 | 0 |
| 29.10.2018 14:00 - 15:00 | 0 | 0 | 0 | 0 |
| 29.10.2018 15:00 - 16:00 | 0 | 0 | 0 | 0 |
| 29.10.2018 16:00 - 17:00 | 0 | 0 | 0 | 0 |
| 29.10.2018 17:00 - 18:00 | 0 | 0 | 0 | 0 |
| 29.10.2018 18:00 - 19:00 | 0 | 0 | 0 | 0 |
| 29.10.2018 19:00 - 20:00 | 0 | 0 | 0 | 0 |
| 29.10.2018 20:00 - 21:00 | 0 | 0 | 0 | 0 |
| 29.10.2018 21:00 - 22:00 | 0 | 0 | 0 | 0 |
| 29.10.2018 22:00 - 23:00 | 0 | 0 | 0 | 0 |
| 29.10.2018 23:00 - 24:00 | 0 | 0 | 0 | 0 |
| 30.10.2018 00:00 - 01:00 | 0 | 0 | 0 | 0 |
| 30.10.2018 01:00 - 02:00 | 0 | 0 | 0 | 0 |
| 30.10.2018 02:00 - 03:00 | 0 | -379 | 0 | 0 |
| 30.10.2018 03:00 - 04:00 | 0 | -379 | 0 | 0 |
| 30.10.2018 04:00 - 05:00 | 0 | -379 | 0 | 0 |
| 30.10.2018 05:00 - 06:00 | 0 | -379 | 0 | 0 |
| 30.10.2018 06:00 - 07:00 | 0 | 0 | 0 | 0 |
| 30.10.2018 07:00 - 08:00 | 0 | 0 | 0 | 0 |
| 30.10.2018 08:00 - 09:00 | 0 | 0 | 0 | 0 |
| 30.10.2018 09:00 - 10:00 | 0 | 0 | 0 | 0 |
| 30.10.2018 10:00 - 11:00 | 0 | 0 | 0 | 0 |
| 30.10.2018 11:00 - 12:00 | 0 | 0 | 0 | 0 |
| 30.10.2018 12:00 - 13:00 | 0 | 0 | 0 | 0 |
| 30.10.2018 13:00 - 14:00 | 0 | 0 | 0 | 0 |
| 30.10.2018 14:00 - 15:00 | 0 | 0 | 0 | 0 |
| 30.10.2018 15:00 - 16:00 | 0 | 0 | 0 | 0 |
| 30.10.2018 16:00 - 17:00 | 0 | 0 | 0 | 0 |
| 30.10.2018 17:00 - 18:00 | 0 | 0 | 0 | 0 |
| 30.10.2018 18:00 - 19:00 | 0 | 0 | 0 | 0 |
| 30.10.2018 19:00 - 20:00 | 0 | 0 | 0 | 0 |
| 30.10.2018 20:00 - 21:00 | 0 | 0 | 0 | 0 |
| 30.10.2018 21:00 - 22:00 | 0 | 0 | 0 | 0 |
| 30.10.2018 22:00 - 23:00 | 0 | 0 | 0 | 0 |
| 30.10.2018 23:00 - 24:00 | 0 | 0 | 0 | 0 |
| 31.10.2018 00:00 - 01:00 | 0 | 0 | 0 | 0 |
| 31.10.2018 01:00 - 02:00 | 0 | 0 | 0 | 0 |
| 31.10.2018 02:00 - 03:00 | 0 | -300 | 0 | 0 |
| 31.10.2018 03:00 - 04:00 | 0 | -300 | 0 | 0 |
| 31.10.2018 04:00 - 05:00 | 0 | -300 | 0 | 0 |
| 31.10.2018 05:00 - 06:00 | 0 | -300 | 0 | 0 |
| 31.10.2018 06:00 - 07:00 | 0 | 0 | 0 | 0 |
| 31.10.2018 07:00 - 08:00 | 0 | 0 | 0 | 0 |
| 31.10.2018 08:00 - 09:00 | 0 | 0 | 0 | 0 |
| 31.10.2018 09:00 - 10:00 | 0 | 0 | 0 | 0 |
| 31.10.2018 10:00 - 11:00 | 0 | 0 | 0 | 0 |
| 31.10.2018 11:00 - 12:00 | 0 | 0 | 0 | 0 |
| 31.10.2018 12:00 - 13:00 | 0 | 0 | 0 | 0 |
| 31.10.2018 13:00 - 14:00 | 0 | 0 | 0 | 0 |
| 31.10.2018 14:00 - 15:00 | 0 | 0 | 0 | 0 |
| 31.10.2018 15:00 - 16:00 | 0 | 0 | 0 | 0 |
| 31.10.2018 16:00 - 17:00 | 0 | 0 | 0 | 0 |
| 31.10.2018 17:00 - 18:00 | 0 | 0 | 0 | 0 |
| 31.10.2018 18:00 - 19:00 | 0 | 0 | 0 | 0 |
| 31.10.2018 19:00 - 20:00 | 0 | 0 | 0 | 0 |
| 31.10.2018 20:00 - 21:00 | 0 | 0 | 0 | 0 |
| 31.10.2018 21:00 - 22:00 | 0 | 0 | 0 | 0 |
| 31.10.2018 22:00 - 23:00 | 0 | 0 | 0 | 0 |
| 31.10.2018 23:00 - 24:00 | 0 | 0 | 0 | 0 |
| 01.11.2018 00:00 - 01:00 | 0 | 0 | 0 | 0 |
| 01.11.2018 01:00 - 02:00 | 0 | 0 | 0 | 0 |
| 01.11.2018 02:00 - 03:00 | 0 | 0 | 0 | 0 |
| 01.11.2018 03:00 - 04:00 | 0 | 0 | 0 | 0 |
| 01.11.2018 04:00 - 05:00 | 0 | 0 | 0 | 0 |
| 01.11.2018 05:00 - 06:00 | 0 | 0 | 0 | 0 |